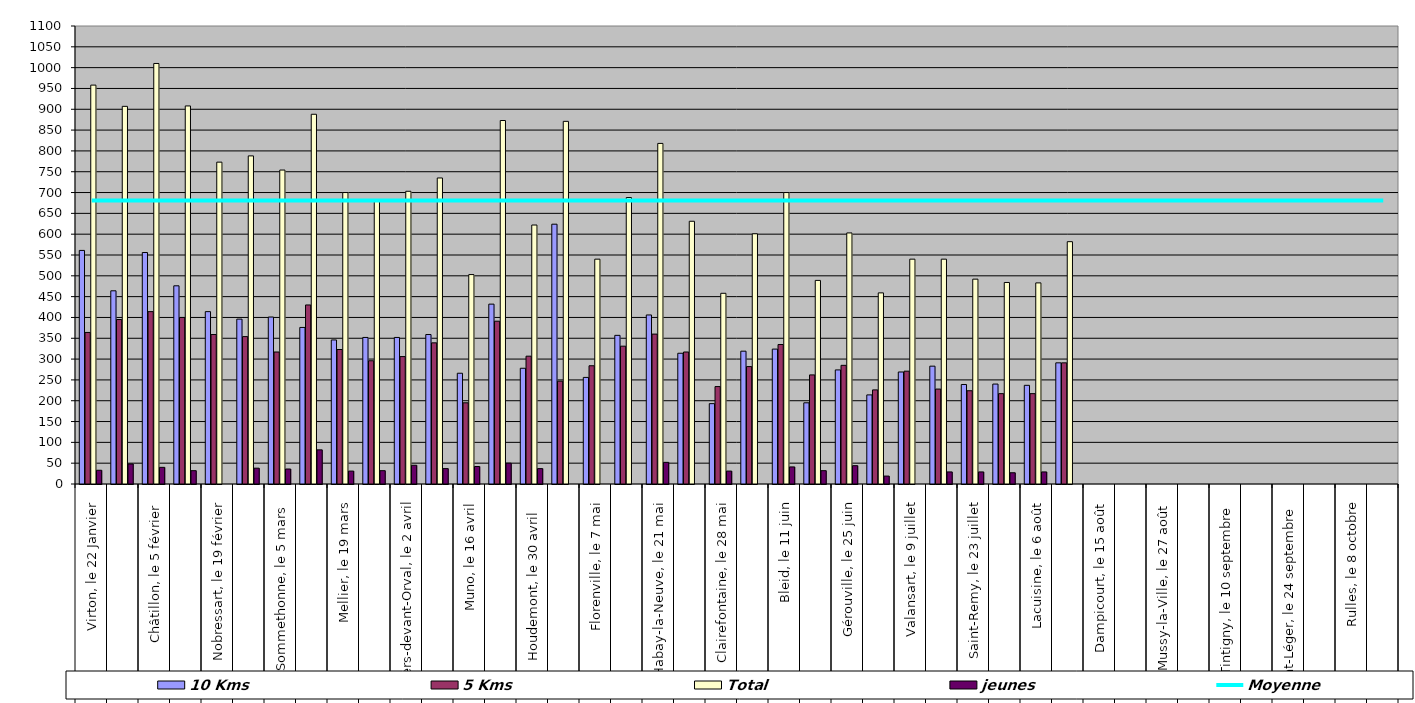
| Category | 10 Kms | 5 Kms | Total | jeunes |
|---|---|---|---|---|
| 0 | 561 | 364 | 958 | 33 |
| 1 | 464 | 395 | 907 | 48 |
| 2 | 556 | 414 | 1010 | 40 |
| 3 | 476 | 400 | 908 | 32 |
| 4 | 414 | 359 | 773 | 0 |
| 5 | 396 | 354 | 788 | 38 |
| 6 | 401 | 317 | 754 | 36 |
| 7 | 376 | 430 | 888 | 82 |
| 8 | 346 | 323 | 700 | 31 |
| 9 | 352 | 296 | 680 | 32 |
| 10 | 352 | 306 | 703 | 45 |
| 11 | 359 | 339 | 735 | 37 |
| 12 | 266 | 195 | 503 | 42 |
| 13 | 432 | 391 | 873 | 50 |
| 14 | 278 | 307 | 622 | 37 |
| 15 | 624 | 247 | 871 | 0 |
| 16 | 256 | 284 | 540 | 0 |
| 17 | 357 | 331 | 688 | 0 |
| 18 | 406 | 360 | 818 | 52 |
| 19 | 314 | 317 | 631 | 0 |
| 20 | 193 | 234 | 458 | 31 |
| 21 | 319 | 282 | 601 | 0 |
| 22 | 324 | 335 | 700 | 41 |
| 23 | 195 | 262 | 489 | 32 |
| 24 | 274 | 285 | 603 | 44 |
| 25 | 214 | 226 | 459 | 19 |
| 26 | 269 | 271 | 540 | 0 |
| 27 | 283 | 228 | 540 | 29 |
| 28 | 239 | 224 | 492 | 29 |
| 29 | 240 | 217 | 484 | 27 |
| 30 | 237 | 217 | 483 | 29 |
| 31 | 291 | 291 | 582 | 0 |
| 32 | 0 | 0 | 0 | 0 |
| 33 | 0 | 0 | 0 | 0 |
| 34 | 0 | 0 | 0 | 0 |
| 35 | 0 | 0 | 0 | 0 |
| 36 | 0 | 0 | 0 | 0 |
| 37 | 0 | 0 | 0 | 0 |
| 38 | 0 | 0 | 0 | 0 |
| 39 | 0 | 0 | 0 | 0 |
| 40 | 0 | 0 | 0 | 0 |
| 41 | 0 | 0 | 0 | 0 |